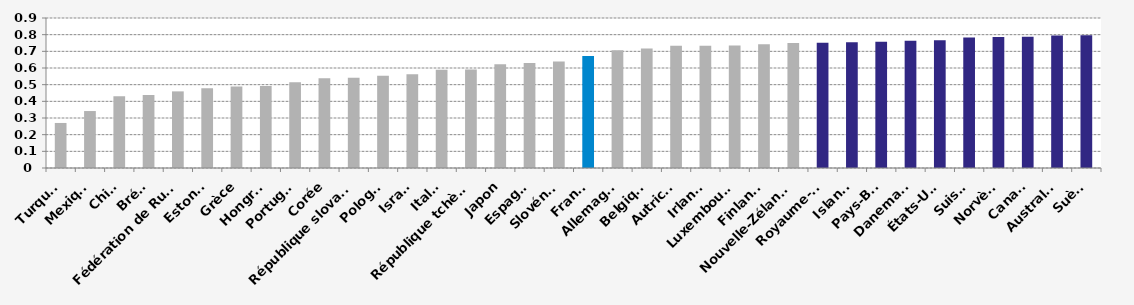
| Category | Score harmonisé |
|---|---|
| Turquie | 0.27 |
| Mexique | 0.342 |
| Chili | 0.43 |
| Brésil | 0.438 |
| Fédération de Russie | 0.46 |
| Estonie | 0.479 |
| Grèce | 0.489 |
| Hongrie | 0.492 |
| Portugal | 0.514 |
| Corée | 0.538 |
| République slovaque | 0.541 |
| Pologne | 0.553 |
| Israel | 0.562 |
| Italie | 0.59 |
| République tchèque | 0.59 |
| Japon | 0.622 |
| Espagne | 0.631 |
| Slovénie | 0.638 |
| France | 0.671 |
| Allemagne | 0.706 |
| Belgique | 0.717 |
| Autriche | 0.734 |
| Irlande | 0.734 |
| Luxembourg | 0.735 |
| Finlande | 0.743 |
| Nouvelle-Zélande | 0.75 |
| Royaume-Uni | 0.752 |
| Islande | 0.754 |
| Pays-Bas | 0.758 |
| Danemark | 0.764 |
| États-Unis | 0.766 |
| Suisse | 0.783 |
| Norvège | 0.786 |
| Canada | 0.787 |
| Australie | 0.795 |
| Suède | 0.797 |